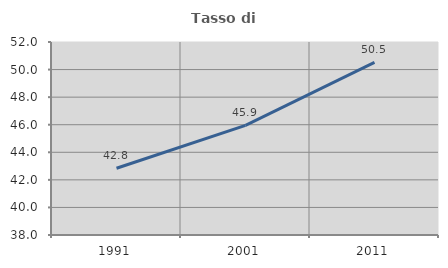
| Category | Tasso di occupazione   |
|---|---|
| 1991.0 | 42.844 |
| 2001.0 | 45.948 |
| 2011.0 | 50.528 |